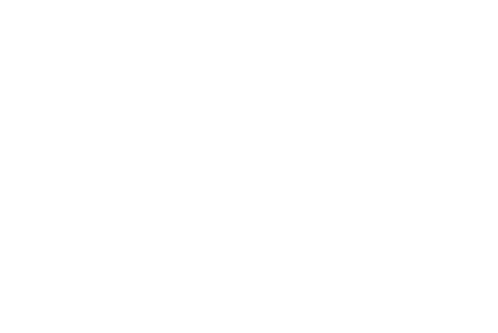
| Category | Khoản tiền gốc đã thanh toán | Lãi đã thanh toán |
|---|---|---|
| 2019 | 316.351 | 226.28 |
| 2020 | 1105.769 | 739.178 |
| 2021 | 1939.715 | 1207.547 |
| 2022 | 2820.703 | 1628.874 |
| 2023 | 3751.386 | 2000.507 |
| 2024 | 4734.566 | 2319.642 |
| 2025 | 5773.206 | 2583.318 |
| 2026 | 6870.433 | 2788.406 |
| 2027 | 8029.552 | 2931.602 |
| 2028 | 9254.054 | 3009.415 |
| 2029 | 10000 | 3023.153 |